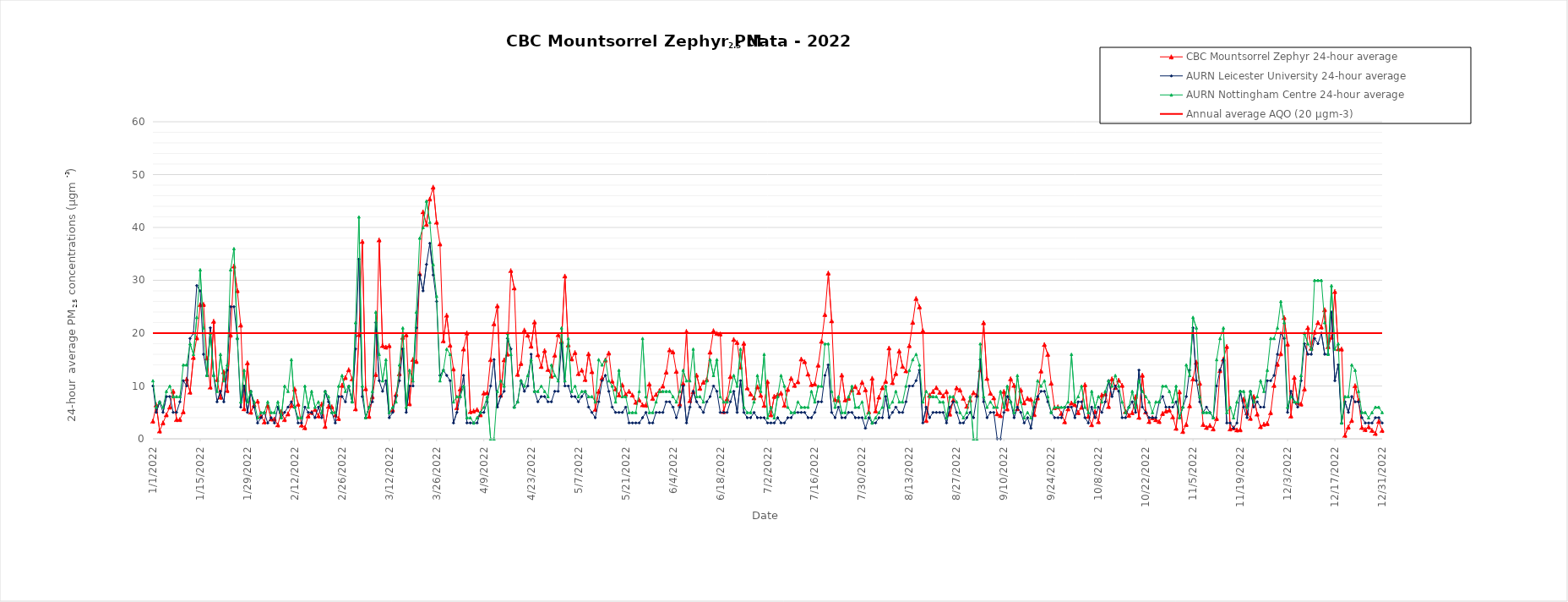
| Category | CBC Mountsorrel Zephyr 24-hour average | AURN Leicester University 24-hour average | AURN Nottingham Centre 24-hour average | Annual average AQO (20 µgm-3) |
|---|---|---|---|---|
| 1/1/22 | 3.35 | 10 | 11 | 20 |
| 1/2/22 | 6.44 | 5 | 6 | 20 |
| 1/3/22 | 1.5 | 7 | 7 | 20 |
| 1/4/22 | 3.03 | 5 | 6 | 20 |
| 1/5/22 | 4.57 | 8 | 9 | 20 |
| 1/6/22 | 6.03 | 8 | 10 | 20 |
| 1/7/22 | 9.02 | 5 | 8 | 20 |
| 1/8/22 | 3.66 | 5 | 8 | 20 |
| 1/9/22 | 3.66 | 7 | 8 | 20 |
| 1/10/22 | 5.12 | 11 | 14 | 20 |
| 1/11/22 | 11.31 | 10 | 14 | 20 |
| 1/12/22 | 8.84 | 19 | 18 | 20 |
| 1/13/22 | 15.42 | 20 | 16 | 20 |
| 1/14/22 | 19.12 | 29 | 23 | 20 |
| 1/15/22 | 25.4 | 28 | 32 | 20 |
| 1/16/22 | 25.44 | 16 | 21 | 20 |
| 1/17/22 | 15.3 | 12 | 12 | 20 |
| 1/18/22 | 9.8 | 21 | 20 | 20 |
| 1/19/22 | 22.26 | 12 | 12 | 20 |
| 1/20/22 | 11.19 | 7 | 9 | 20 |
| 1/21/22 | 7.89 | 9 | 16 | 20 |
| 1/22/22 | 12.71 | 7 | 11 | 20 |
| 1/23/22 | 9.15 | 13 | 14 | 20 |
| 1/24/22 | 19.65 | 25 | 32 | 20 |
| 1/25/22 | 32.7 | 25 | 36 | 20 |
| 1/26/22 | 28.05 | 19 | 19 | 20 |
| 1/27/22 | 21.53 | 6 | 7 | 20 |
| 1/28/22 | 5.7 | 10 | 13 | 20 |
| 1/29/22 | 14.38 | 5 | 7 | 20 |
| 1/30/22 | 5.05 | 9 | 9 | 20 |
| 1/31/22 | 6.43 | 6 | 7 | 20 |
| 2/1/22 | 7.12 | 3 | 4 | 20 |
| 2/2/22 | 4.33 | 4 | 5 | 20 |
| 2/3/22 | 3.2 | 5 | 5 | 20 |
| 2/4/22 | 6.3 | 3 | 7 | 20 |
| 2/5/22 | 3.77 | 4 | 5 | 20 |
| 2/6/22 | 3.77 | 3 | 5 | 20 |
| 2/7/22 | 2.64 | 6 | 7 | 20 |
| 2/8/22 | 5.15 | 4 | 4 | 20 |
| 2/9/22 | 3.65 | 5 | 10 | 20 |
| 2/10/22 | 4.74 | 6 | 9 | 20 |
| 2/11/22 | 6.31 | 7 | 15 | 20 |
| 2/12/22 | 9.43 | 6 | 6 | 20 |
| 2/13/22 | 6.56 | 3 | 4 | 20 |
| 2/14/22 | 2.6 | 3 | 4 | 20 |
| 2/15/22 | 2.12 | 6 | 10 | 20 |
| 2/16/22 | 4.34 | 5 | 6 | 20 |
| 2/17/22 | 4.99 | 5 | 9 | 20 |
| 2/18/22 | 5.55 | 4 | 6 | 20 |
| 2/19/22 | 4.35 | 6 | 7 | 20 |
| 2/20/22 | 6.6 | 4 | 5 | 20 |
| 2/21/22 | 2.35 | 9 | 9 | 20 |
| 2/22/22 | 6.16 | 7 | 8 | 20 |
| 2/23/22 | 6.07 | 5 | 5 | 20 |
| 2/24/22 | 4.53 | 3 | 5 | 20 |
| 2/25/22 | 3.85 | 8 | 10 | 20 |
| 2/26/22 | 10.14 | 8 | 12 | 20 |
| 2/27/22 | 11.61 | 7 | 9 | 20 |
| 2/28/22 | 13.09 | 10 | 10 | 20 |
| 3/1/22 | 11.35 | 7 | 7 | 20 |
| 3/2/22 | 5.68 | 17 | 22 | 20 |
| 3/3/22 | 19.73 | 34 | 42 | 20 |
| 3/4/22 | 37.35 | 8 | 10 | 20 |
| 3/5/22 | 9.49 | 4 | 4 | 20 |
| 3/6/22 | 4.26 | 6 | 6 | 20 |
| 3/7/22 | 7.95 | 7 | 9 | 20 |
| 3/8/22 | 12.18 | 22 | 24 | 20 |
| 3/9/22 | 37.65 | 11 | 16 | 20 |
| 3/10/22 | 17.66 | 9 | 11 | 20 |
| 3/11/22 | 17.37 | 11 | 15 | 20 |
| 3/12/22 | 17.64 | 4 | 5 | 20 |
| 3/13/22 | 5.48 | 5 | 6 | 20 |
| 3/14/22 | 8.45 | 8 | 7 | 20 |
| 3/15/22 | 12.32 | 11 | 14 | 20 |
| 3/16/22 | 19.23 | 17 | 21 | 20 |
| 3/17/22 | 19.69 | 5 | 6 | 20 |
| 3/18/22 | 6.64 | 10 | 13 | 20 |
| 3/19/22 | 15.02 | 10 | 11 | 20 |
| 3/20/22 | 14.66 | 21 | 24 | 20 |
| 3/21/22 | 31.26 | 31 | 38 | 20 |
| 3/22/22 | 42.96 | 28 | 40 | 20 |
| 3/23/22 | 40.59 | 33 | 45 | 20 |
| 3/24/22 | 45.39 | 37 | 41 | 20 |
| 3/25/22 | 47.63 | 31 | 33 | 20 |
| 3/26/22 | 41.01 | 26 | 27 | 20 |
| 3/27/22 | 36.89 | 12 | 11 | 20 |
| 3/28/22 | 18.55 | 13 | 13 | 20 |
| 3/29/22 | 23.4 | 12 | 17 | 20 |
| 3/30/22 | 17.71 | 11 | 16 | 20 |
| 3/31/22 | 13.23 | 3 | 7 | 20 |
| 4/1/22 | 5.89 | 5 | 8 | 20 |
| 4/2/22 | 9.45 | 8 | 8 | 20 |
| 4/3/22 | 17.02 | 12 | 10 | 20 |
| 4/4/22 | 20.03 | 3 | 4 | 20 |
| 4/5/22 | 5.16 | 3 | 4 | 20 |
| 4/6/22 | 5.28 | 3 | 3 | 20 |
| 4/7/22 | 5.53 | 3 | 4 | 20 |
| 4/8/22 | 4.57 | 5 | 5 | 20 |
| 4/9/22 | 8.68 | 5 | 6 | 20 |
| 4/10/22 | 8.72 | 7 | 8 | 20 |
| 4/11/22 | 14.99 | 10 | 0 | 20 |
| 4/12/22 | 21.78 | 15 | 0 | 20 |
| 4/13/22 | 25.18 | 6 | 9 | 20 |
| 4/14/22 | 8.28 | 8 | 11 | 20 |
| 4/15/22 | 14.95 | 9 | 10 | 20 |
| 4/16/22 | 16.06 | 19 | 20 | 20 |
| 4/17/22 | 31.83 | 17 | 16 | 20 |
| 4/18/22 | 28.56 | 6 | 6 | 20 |
| 4/19/22 | 12.22 | 7 | 7 | 20 |
| 4/20/22 | 14.27 | 11 | 11 | 20 |
| 4/21/22 | 20.59 | 9 | 10 | 20 |
| 4/22/22 | 19.62 | 10 | 12 | 20 |
| 4/23/22 | 17.54 | 16 | 15 | 20 |
| 4/24/22 | 22.12 | 9 | 9 | 20 |
| 4/25/22 | 15.91 | 7 | 9 | 20 |
| 4/26/22 | 13.7 | 8 | 10 | 20 |
| 4/27/22 | 16.71 | 8 | 9 | 20 |
| 4/28/22 | 13.14 | 7 | 8 | 20 |
| 4/29/22 | 11.9 | 7 | 14 | 20 |
| 4/30/22 | 15.84 | 9 | 12 | 20 |
| 5/1/22 | 19.71 | 9 | 11 | 20 |
| 5/2/22 | 18.45 | 18 | 21 | 20 |
| 5/3/22 | 30.81 | 10 | 11 | 20 |
| 5/4/22 | 17.78 | 10 | 19 | 20 |
| 5/5/22 | 15.14 | 8 | 9 | 20 |
| 5/6/22 | 16.33 | 8 | 10 | 20 |
| 5/7/22 | 12.35 | 7 | 8 | 20 |
| 5/8/22 | 13.01 | 8 | 9 | 20 |
| 5/9/22 | 11.23 | 9 | 9 | 20 |
| 5/10/22 | 16.09 | 6 | 8 | 20 |
| 5/11/22 | 12.71 | 5 | 8 | 20 |
| 5/12/22 | 5.59 | 4 | 7 | 20 |
| 5/13/22 | 9.02 | 7 | 15 | 20 |
| 5/14/22 | 11.53 | 11 | 14 | 20 |
| 5/15/22 | 14.92 | 12 | 15 | 20 |
| 5/16/22 | 16.25 | 9 | 11 | 20 |
| 5/17/22 | 10.92 | 6 | 10 | 20 |
| 5/18/22 | 9.45 | 5 | 7 | 20 |
| 5/19/22 | 8.32 | 5 | 13 | 20 |
| 5/20/22 | 10.21 | 5 | 8 | 20 |
| 5/21/22 | 8.43 | 6 | 8 | 20 |
| 5/22/22 | 9.01 | 3 | 5 | 20 |
| 5/23/22 | 8.29 | 3 | 5 | 20 |
| 5/24/22 | 6.93 | 3 | 5 | 20 |
| 5/25/22 | 7.38 | 3 | 9 | 20 |
| 5/26/22 | 6.45 | 4 | 19 | 20 |
| 5/27/22 | 6.36 | 5 | 8 | 20 |
| 5/28/22 | 10.37 | 3 | 5 | 20 |
| 5/29/22 | 7.65 | 3 | 5 | 20 |
| 5/30/22 | 8.4 | 5 | 7 | 20 |
| 5/31/22 | 9.13 | 5 | 9 | 20 |
| 6/1/22 | 10 | 5 | 9 | 20 |
| 6/2/22 | 12.64 | 7 | 9 | 20 |
| 6/3/22 | 16.84 | 7 | 9 | 20 |
| 6/4/22 | 16.45 | 6 | 8 | 20 |
| 6/5/22 | 12.78 | 4 | 7 | 20 |
| 6/6/22 | 6.6 | 6 | 9 | 20 |
| 6/7/22 | 10.49 | 10 | 13 | 20 |
| 6/8/22 | 20.33 | 3 | 11 | 20 |
| 6/9/22 | 7.23 | 6 | 11 | 20 |
| 6/10/22 | 8.94 | 9 | 17 | 20 |
| 6/11/22 | 12.07 | 7 | 8 | 20 |
| 6/12/22 | 9.56 | 6 | 8 | 20 |
| 6/13/22 | 10.74 | 5 | 7 | 20 |
| 6/14/22 | 11.22 | 7 | 11 | 20 |
| 6/15/22 | 16.42 | 8 | 15 | 20 |
| 6/16/22 | 20.46 | 10 | 12 | 20 |
| 6/17/22 | 19.95 | 9 | 15 | 20 |
| 6/18/22 | 19.84 | 5 | 8 | 20 |
| 6/19/22 | 5.16 | 5 | 7 | 20 |
| 6/20/22 | 7.56 | 5 | 7 | 20 |
| 6/21/22 | 11.79 | 7 | 9 | 20 |
| 6/22/22 | 18.82 | 9 | 12 | 20 |
| 6/23/22 | 18.24 | 5 | 10 | 20 |
| 6/24/22 | 13.57 | 11 | 17 | 20 |
| 6/25/22 | 18.07 | 5 | 6 | 20 |
| 6/26/22 | 9.64 | 4 | 5 | 20 |
| 6/27/22 | 8.5 | 4 | 5 | 20 |
| 6/28/22 | 7.75 | 5 | 7 | 20 |
| 6/29/22 | 9.86 | 4 | 12 | 20 |
| 6/30/22 | 8.24 | 4 | 9 | 20 |
| 7/1/22 | 6.34 | 4 | 16 | 20 |
| 7/2/22 | 10.83 | 3 | 4 | 20 |
| 7/3/22 | 4.56 | 3 | 6 | 20 |
| 7/4/22 | 8.05 | 3 | 4 | 20 |
| 7/5/22 | 8.37 | 4 | 8 | 20 |
| 7/6/22 | 8.66 | 3 | 12 | 20 |
| 7/7/22 | 6.35 | 3 | 10 | 20 |
| 7/8/22 | 9.37 | 4 | 6 | 20 |
| 7/9/22 | 11.46 | 4 | 5 | 20 |
| 7/10/22 | 10.13 | 5 | 5 | 20 |
| 7/11/22 | 10.81 | 5 | 7 | 20 |
| 7/12/22 | 15.11 | 5 | 6 | 20 |
| 7/13/22 | 14.62 | 5 | 6 | 20 |
| 7/14/22 | 12.26 | 4 | 6 | 20 |
| 7/15/22 | 10.28 | 4 | 9 | 20 |
| 7/16/22 | 10.39 | 5 | 7 | 20 |
| 7/17/22 | 13.95 | 7 | 10 | 20 |
| 7/18/22 | 18.47 | 7 | 10 | 20 |
| 7/19/22 | 23.53 | 12 | 18 | 20 |
| 7/20/22 | 31.37 | 14 | 18 | 20 |
| 7/21/22 | 22.34 | 5 | 9 | 20 |
| 7/22/22 | 7.45 | 4 | 6 | 20 |
| 7/23/22 | 7.31 | 6 | 8 | 20 |
| 7/24/22 | 12.07 | 4 | 5 | 20 |
| 7/25/22 | 7.38 | 4 | 5 | 20 |
| 7/26/22 | 7.7 | 5 | 8 | 20 |
| 7/27/22 | 9.27 | 5 | 10 | 20 |
| 7/28/22 | 9.88 | 4 | 6 | 20 |
| 7/29/22 | 8.78 | 4 | 6 | 20 |
| 7/30/22 | 10.71 | 4 | 7 | 20 |
| 7/31/22 | 9.3 | 2 | 4 | 20 |
| 8/1/22 | 5.12 | 4 | 5 | 20 |
| 8/2/22 | 11.47 | 3 | 3 | 20 |
| 8/3/22 | 5.3 | 3 | 4 | 20 |
| 8/4/22 | 7.92 | 4 | 5 | 20 |
| 8/5/22 | 9.69 | 4 | 6 | 20 |
| 8/6/22 | 10.9 | 8 | 10 | 20 |
| 8/7/22 | 17.2 | 4 | 6 | 20 |
| 8/8/22 | 10.64 | 5 | 7 | 20 |
| 8/9/22 | 12.38 | 6 | 9 | 20 |
| 8/10/22 | 16.63 | 5 | 7 | 20 |
| 8/11/22 | 13.71 | 5 | 7 | 20 |
| 8/12/22 | 12.87 | 7 | 10 | 20 |
| 8/13/22 | 17.65 | 10 | 13 | 20 |
| 8/14/22 | 22.06 | 10 | 15 | 20 |
| 8/15/22 | 26.56 | 11 | 16 | 20 |
| 8/16/22 | 24.98 | 13 | 14 | 20 |
| 8/17/22 | 20.47 | 3 | 7 | 20 |
| 8/18/22 | 3.48 | 6 | 9 | 20 |
| 8/19/22 | 8.28 | 4 | 8 | 20 |
| 8/20/22 | 8.97 | 5 | 8 | 20 |
| 8/21/22 | 9.7 | 5 | 8 | 20 |
| 8/22/22 | 8.81 | 5 | 7 | 20 |
| 8/23/22 | 8.14 | 5 | 7 | 20 |
| 8/24/22 | 8.93 | 3 | 4 | 20 |
| 8/25/22 | 4.7 | 6 | 8 | 20 |
| 8/26/22 | 7.34 | 7 | 8 | 20 |
| 8/27/22 | 9.66 | 5 | 7 | 20 |
| 8/28/22 | 9.24 | 3 | 5 | 20 |
| 8/29/22 | 7.68 | 3 | 4 | 20 |
| 8/30/22 | 6.16 | 4 | 5 | 20 |
| 8/31/22 | 7.35 | 5 | 8 | 20 |
| 9/1/22 | 8.75 | 4 | 0 | 20 |
| 9/2/22 | 8.3 | 8 | 0 | 20 |
| 9/3/22 | 13.08 | 15 | 18 | 20 |
| 9/4/22 | 21.98 | 7 | 8 | 20 |
| 9/5/22 | 11.43 | 4 | 6 | 20 |
| 9/6/22 | 8.64 | 5 | 7 | 20 |
| 9/7/22 | 7.76 | 5 | 6 | 20 |
| 9/8/22 | 4.74 | 0 | 6 | 20 |
| 9/9/22 | 4.4 | 0 | 9 | 20 |
| 9/10/22 | 8.97 | 5 | 6 | 20 |
| 9/11/22 | 5.67 | 8 | 10 | 20 |
| 9/12/22 | 11.37 | 7 | 7 | 20 |
| 9/13/22 | 10.13 | 4 | 5 | 20 |
| 9/14/22 | 5.73 | 6 | 12 | 20 |
| 9/15/22 | 9.27 | 5 | 7 | 20 |
| 9/16/22 | 6.82 | 3 | 4 | 20 |
| 9/17/22 | 7.65 | 4 | 5 | 20 |
| 9/18/22 | 7.47 | 2 | 4 | 20 |
| 9/19/22 | 4.61 | 6 | 7 | 20 |
| 9/20/22 | 7.75 | 8 | 11 | 20 |
| 9/21/22 | 12.84 | 9 | 10 | 20 |
| 9/22/22 | 17.85 | 9 | 11 | 20 |
| 9/23/22 | 15.98 | 7 | 8 | 20 |
| 9/24/22 | 10.54 | 5 | 5 | 20 |
| 9/25/22 | 5.91 | 4 | 6 | 20 |
| 9/26/22 | 6.06 | 4 | 6 | 20 |
| 9/27/22 | 4.82 | 4 | 6 | 20 |
| 9/28/22 | 3.24 | 6 | 6 | 20 |
| 9/29/22 | 5.69 | 6 | 7 | 20 |
| 9/30/22 | 6.8 | 6 | 16 | 20 |
| 10/1/22 | 6.49 | 4 | 7 | 20 |
| 10/2/22 | 4.98 | 7 | 8 | 20 |
| 10/3/22 | 5.99 | 7 | 10 | 20 |
| 10/4/22 | 10.24 | 4 | 6 | 20 |
| 10/5/22 | 4.26 | 3 | 5 | 20 |
| 10/6/22 | 2.69 | 6 | 9 | 20 |
| 10/7/22 | 5.16 | 4 | 6 | 20 |
| 10/8/22 | 3.26 | 6 | 8 | 20 |
| 10/9/22 | 8.31 | 5 | 7 | 20 |
| 10/10/22 | 8.5 | 7 | 9 | 20 |
| 10/11/22 | 6.14 | 11 | 11 | 20 |
| 10/12/22 | 11.37 | 8 | 10 | 20 |
| 10/13/22 | 9.73 | 10 | 12 | 20 |
| 10/14/22 | 11.11 | 9 | 10 | 20 |
| 10/15/22 | 10.14 | 4 | 7 | 20 |
| 10/16/22 | 5.18 | 4 | 5 | 20 |
| 10/17/22 | 4.45 | 6 | 6 | 20 |
| 10/18/22 | 4.96 | 7 | 9 | 20 |
| 10/19/22 | 7.99 | 5 | 6 | 20 |
| 10/20/22 | 4.08 | 13 | 11 | 20 |
| 10/21/22 | 12.04 | 6 | 9 | 20 |
| 10/22/22 | 5.09 | 5 | 8 | 20 |
| 10/23/22 | 3.27 | 4 | 7 | 20 |
| 10/24/22 | 3.99 | 4 | 5 | 20 |
| 10/25/22 | 3.62 | 4 | 7 | 20 |
| 10/26/22 | 3.28 | 7 | 7 | 20 |
| 10/27/22 | 4.81 | 8 | 10 | 20 |
| 10/28/22 | 5.26 | 6 | 10 | 20 |
| 10/29/22 | 5.44 | 6 | 9 | 20 |
| 10/30/22 | 4.15 | 6 | 7 | 20 |
| 10/31/22 | 2 | 7 | 10 | 20 |
| 11/1/22 | 8.9 | 4 | 4 | 20 |
| 11/2/22 | 1.4 | 6 | 6 | 20 |
| 11/3/22 | 2.73 | 8 | 14 | 20 |
| 11/4/22 | 6.26 | 13 | 12 | 20 |
| 11/5/22 | 11.35 | 21 | 23 | 20 |
| 11/6/22 | 14.53 | 11 | 21 | 20 |
| 11/7/22 | 10.51 | 7 | 8 | 20 |
| 11/8/22 | 2.72 | 5 | 5 | 20 |
| 11/9/22 | 2.16 | 6 | 5 | 20 |
| 11/10/22 | 2.54 | 5 | 5 | 20 |
| 11/11/22 | 1.89 | 4 | 4 | 20 |
| 11/12/22 | 3.85 | 10 | 15 | 20 |
| 11/13/22 | 12.91 | 13 | 19 | 20 |
| 11/14/22 | 15.09 | 15 | 21 | 20 |
| 11/15/22 | 17.48 | 3 | 5 | 20 |
| 11/16/22 | 1.89 | 3 | 6 | 20 |
| 11/17/22 | 2.07 | 2 | 4 | 20 |
| 11/18/22 | 1.69 | 3 | 7 | 20 |
| 11/19/22 | 1.73 | 9 | 9 | 20 |
| 11/20/22 | 7.52 | 6 | 9 | 20 |
| 11/21/22 | 4.93 | 4 | 6 | 20 |
| 11/22/22 | 3.88 | 9 | 9 | 20 |
| 11/23/22 | 7.99 | 6 | 7 | 20 |
| 11/24/22 | 4.7 | 7 | 8 | 20 |
| 11/25/22 | 2.31 | 6 | 11 | 20 |
| 11/26/22 | 2.78 | 6 | 9 | 20 |
| 11/27/22 | 2.9 | 11 | 13 | 20 |
| 11/28/22 | 4.95 | 11 | 19 | 20 |
| 11/29/22 | 10.13 | 12 | 19 | 20 |
| 11/30/22 | 14.13 | 16 | 21 | 20 |
| 12/1/22 | 16.12 | 20 | 26 | 20 |
| 12/2/22 | 22.95 | 19 | 22 | 20 |
| 12/3/22 | 17.93 | 5 | 6 | 20 |
| 12/4/22 | 4.32 | 9 | 8 | 20 |
| 12/5/22 | 11.62 | 7 | 7 | 20 |
| 12/6/22 | 6.91 | 6 | 7 | 20 |
| 12/7/22 | 6.59 | 11 | 12 | 20 |
| 12/8/22 | 9.44 | 18 | 20 | 20 |
| 12/9/22 | 21.03 | 16 | 18 | 20 |
| 12/10/22 | 17.15 | 16 | 17 | 20 |
| 12/11/22 | 20.19 | 19 | 30 | 20 |
| 12/12/22 | 22.01 | 18 | 30 | 20 |
| 12/13/22 | 21.17 | 20 | 30 | 20 |
| 12/14/22 | 24.44 | 16 | 22 | 20 |
| 12/15/22 | 17.45 | 16 | 16 | 20 |
| 12/16/22 | 19.26 | 24 | 29 | 20 |
| 12/17/22 | 27.88 | 11 | 17 | 20 |
| 12/18/22 | 17.03 | 14 | 18 | 20 |
| 12/19/22 | 17 | 3 | 3 | 20 |
| 12/20/22 | 0.67 | 7 | 8 | 20 |
| 12/21/22 | 2.23 | 5 | 8 | 20 |
| 12/22/22 | 3.49 | 8 | 14 | 20 |
| 12/23/22 | 10.06 | 7 | 13 | 20 |
| 12/24/22 | 7.28 | 7 | 9 | 20 |
| 12/25/22 | 2.15 | 4 | 5 | 20 |
| 12/26/22 | 1.76 | 3 | 5 | 20 |
| 12/27/22 | 2.27 | 3 | 4 | 20 |
| 12/28/22 | 1.61 | 3 | 5 | 20 |
| 12/29/22 | 1.03 | 4 | 6 | 20 |
| 12/30/22 | 3.32 | 4 | 6 | 20 |
| 12/31/22 | 1.59 | 3 | 5 | 20 |